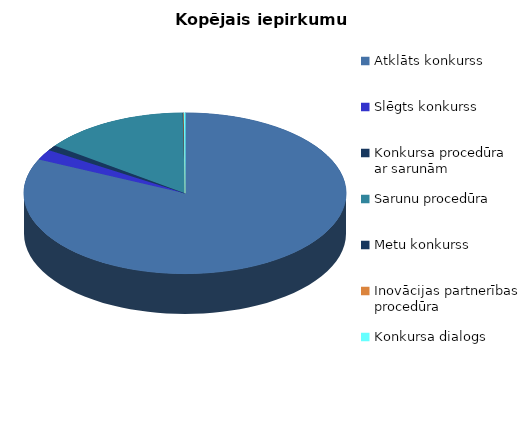
| Category | Kopā |
|---|---|
| Atklāts konkurss | 702 |
| Slēgts konkurss | 18 |
| Konkursa procedūra ar sarunām | 9 |
| Sarunu procedūra | 126 |
| Metu konkurss | 1 |
| Inovācijas partnerības procedūra | 0 |
| Konkursa dialogs | 1 |